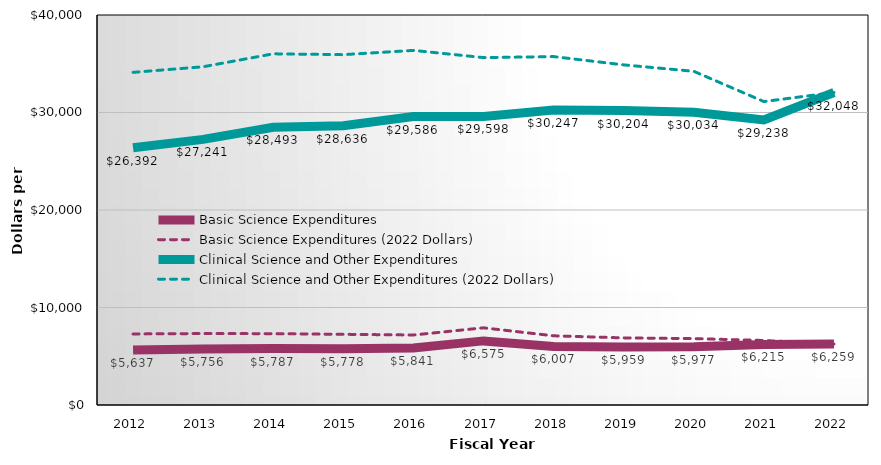
| Category | Basic Science Expenditures | Basic Science Expenditures (2022 Dollars) | Clinical Science and Other Expenditures | Clinical Science and Other Expenditures (2022 Dollars) |
|---|---|---|---|---|
| 2012.0 | 5637 | 7287.01 | 26392 | 34117.221 |
| 2013.0 | 5756 | 7330.344 | 27241 | 34691.782 |
| 2014.0 | 5787 | 7315.37 | 28493 | 36018.115 |
| 2015.0 | 5778 | 7250.271 | 28636 | 35932.636 |
| 2016.0 | 5841 | 7180.347 | 29586 | 36370.1 |
| 2017.0 | 6575 | 7915.471 | 29598 | 35632.258 |
| 2018.0 | 6007 | 7096.721 | 30247 | 35734.065 |
| 2019.0 | 5959 | 6882.402 | 30204 | 34884.386 |
| 2020.0 | 5977 | 6811.066 | 30034 | 34225.124 |
| 2021.0 | 6215 | 6615.516 | 29238 | 31122.197 |
| 2022.0 | 6259 | 6259 | 32048 | 32048 |